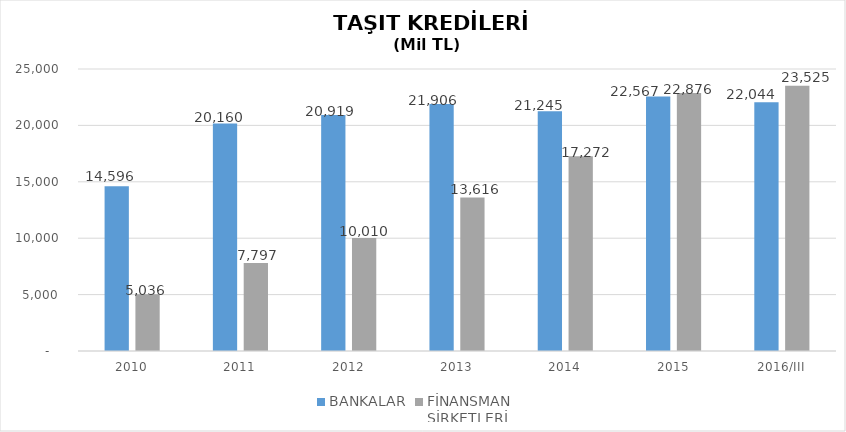
| Category | BANKALAR | FİNANSMAN 
ŞİRKETLERİ |
|---|---|---|
| 2010 | 14596 | 5035.89 |
| 2011 | 20160 | 7796.854 |
| 2012 | 20919 | 10009.755 |
| 2013 | 21906 | 13616.036 |
| 2014 | 21245 | 17271.844 |
| 2015 | 22567 | 22875.563 |
| 2016/III | 22044 | 23525.123 |